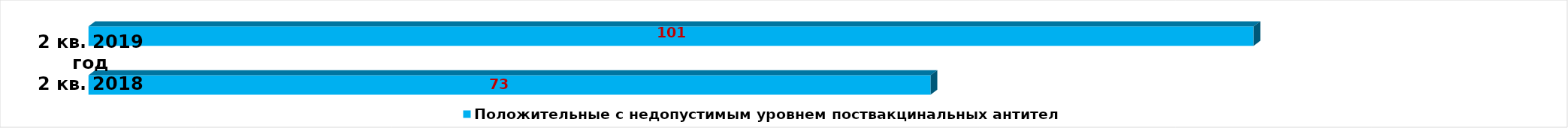
| Category | Положительные с недопустимым уровнем поствакцинальных антител |
|---|---|
| Положительные с недопустимым уровнем поствакцинальных антител | 73 |